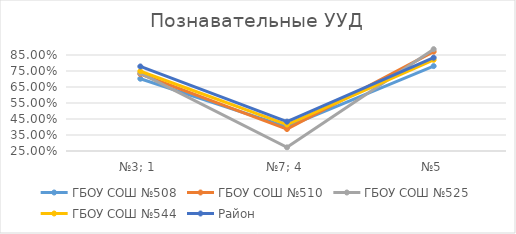
| Category | ГБОУ СОШ №508 | ГБОУ СОШ №510 | ГБОУ СОШ №525 | ГБОУ СОШ №544 | Район |
|---|---|---|---|---|---|
| №3; 1 | 0.702 | 0.731 | 0.736 | 0.749 | 0.778 |
| №7; 4 | 0.4 | 0.387 | 0.273 | 0.415 | 0.433 |
| №5 | 0.781 | 0.871 | 0.886 | 0.82 | 0.833 |